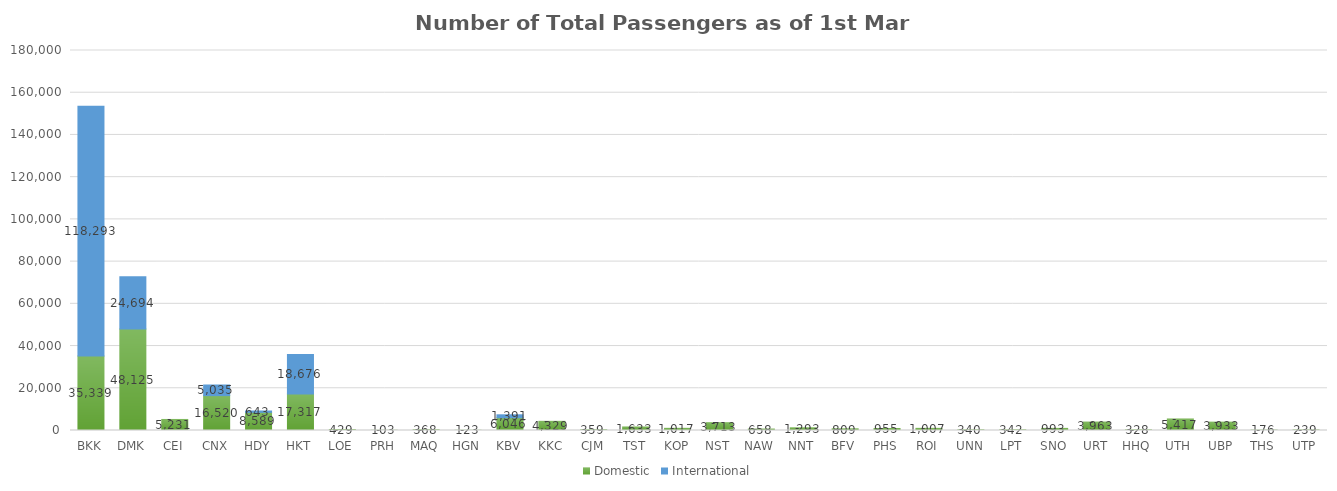
| Category | Domestic | International |
|---|---|---|
| BKK | 35339 | 118293 |
| DMK | 48125 | 24694 |
| CEI | 5231 | 0 |
| CNX | 16520 | 5035 |
| HDY | 8589 | 643 |
| HKT | 17317 | 18676 |
| LOE | 429 | 0 |
| PRH | 103 | 0 |
| MAQ | 368 | 0 |
| HGN | 123 | 0 |
| KBV | 6046 | 1391 |
| KKC | 4329 | 0 |
| CJM | 359 | 0 |
| TST | 1633 | 0 |
| KOP | 1017 | 0 |
| NST | 3713 | 0 |
| NAW | 658 | 0 |
| NNT | 1293 | 0 |
| BFV | 809 | 0 |
| PHS | 955 | 0 |
| ROI | 1007 | 0 |
| UNN | 340 | 0 |
| LPT | 342 | 0 |
| SNO | 993 | 0 |
| URT | 3963 | 0 |
| HHQ | 328 | 0 |
| UTH | 5417 | 0 |
| UBP | 3933 | 0 |
| THS | 176 | 0 |
| UTP | 239 | 0 |